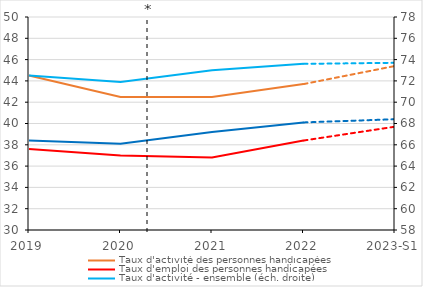
| Category | Taux d'activité des personnes handicapées | Taux d'emploi des personnes handicapées |
|---|---|---|
| 2019 | 44.5 | 37.6 |
| 2020 | 42.5 | 37 |
| 2021 | 42.5 | 36.8 |
| 2022 | 43.7 | 38.4 |
| 2023-S1 | 45.4 | 39.7 |